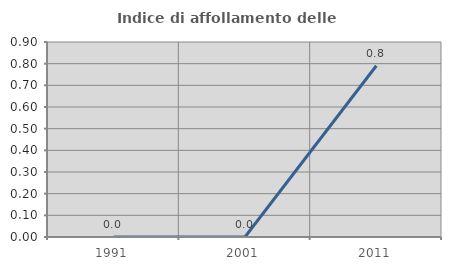
| Category | Indice di affollamento delle abitazioni  |
|---|---|
| 1991.0 | 0 |
| 2001.0 | 0 |
| 2011.0 | 0.791 |